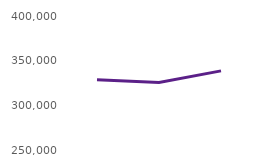
| Category | Users accessing the website |
|---|---|
| Aug23 | 328726 |
| Sep23 | 325581 |
| Oct23 | 338597 |